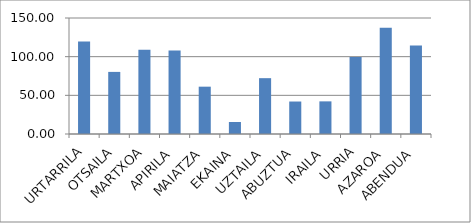
| Category | Series 0 |
|---|---|
| URTARRILA | 119.6 |
| OTSAILA | 80.3 |
| MARTXOA | 108.8 |
| APIRILA | 107.9 |
| MAIATZA | 61.2 |
| EKAINA | 15.5 |
| UZTAILA | 72.2 |
| ABUZTUA | 42 |
| IRAILA | 42.2 |
| URRIA | 99.5 |
| AZAROA | 137.5 |
| ABENDUA | 114.5 |